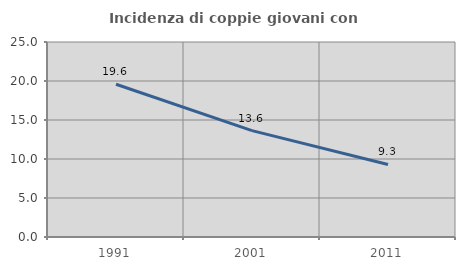
| Category | Incidenza di coppie giovani con figli |
|---|---|
| 1991.0 | 19.588 |
| 2001.0 | 13.636 |
| 2011.0 | 9.297 |